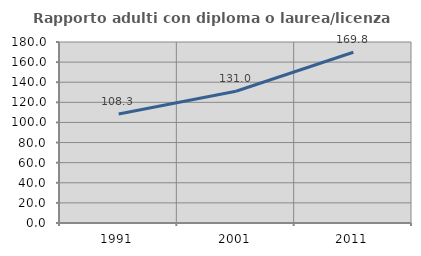
| Category | Rapporto adulti con diploma o laurea/licenza media  |
|---|---|
| 1991.0 | 108.324 |
| 2001.0 | 130.982 |
| 2011.0 | 169.838 |